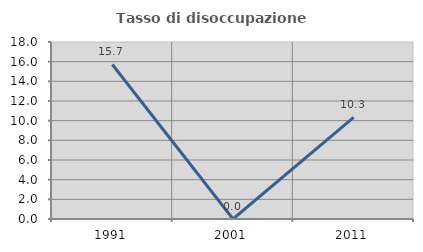
| Category | Tasso di disoccupazione giovanile  |
|---|---|
| 1991.0 | 15.714 |
| 2001.0 | 0 |
| 2011.0 | 10.345 |